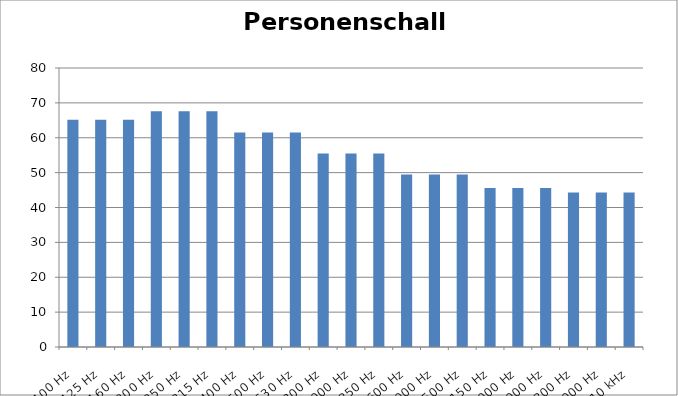
| Category | Series 0 |
|---|---|
| 100 Hz | 65.183 |
| 125 Hz | 65.183 |
| 160 Hz | 65.183 |
| 200 Hz | 67.583 |
| 250 Hz | 67.583 |
| 315 Hz | 67.583 |
| 400 Hz | 61.483 |
| 500 Hz | 61.483 |
| 630 Hz | 61.483 |
| 800 Hz | 55.483 |
| 1000 Hz | 55.483 |
| 1250 Hz | 55.483 |
| 1600 Hz | 49.483 |
| 2000 Hz | 49.483 |
| 2500 Hz | 49.483 |
| 3150 Hz | 45.583 |
| 4000 Hz | 45.583 |
| 5000 Hz | 45.583 |
| 6300 Hz | 44.283 |
| 8000 Hz | 44.283 |
| 10 kHz | 44.283 |